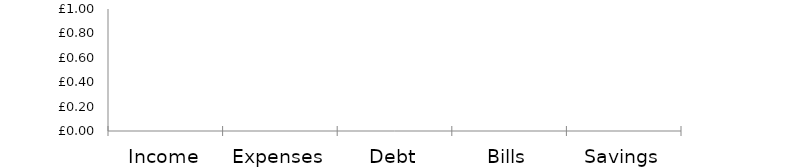
| Category | MONTHLY OVERVIEW |
|---|---|
| Income | 0 |
| Expenses | 0 |
| Debt | 0 |
| Bills | 0 |
| Savings | 0 |